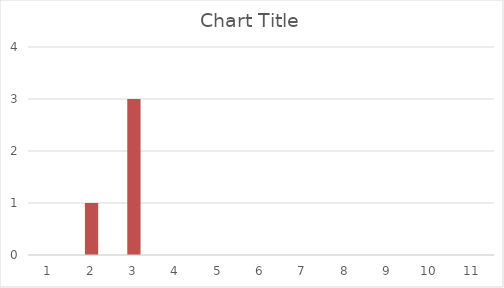
| Category | Series 1 |
|---|---|
| 0 | 0 |
| 1 | 1 |
| 2 | 3 |
| 3 | 0 |
| 4 | 0 |
| 5 | 0 |
| 6 | 0 |
| 7 | 0 |
| 8 | 0 |
| 9 | 0 |
| 10 | 0 |